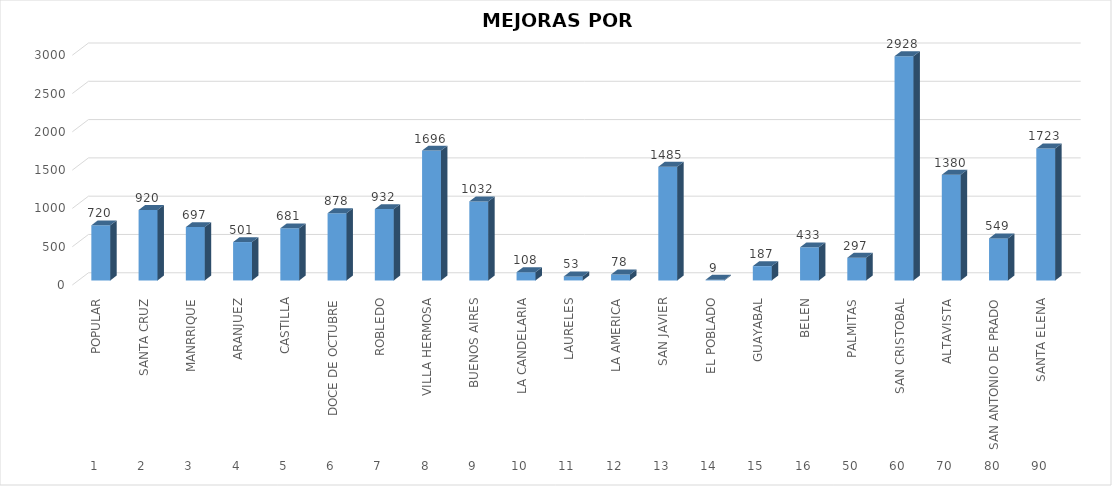
| Category | Mejoras |
|---|---|
| 0 | 720 |
| 1 | 920 |
| 2 | 697 |
| 3 | 501 |
| 4 | 681 |
| 5 | 878 |
| 6 | 932 |
| 7 | 1696 |
| 8 | 1032 |
| 9 | 108 |
| 10 | 53 |
| 11 | 78 |
| 12 | 1485 |
| 13 | 9 |
| 14 | 187 |
| 15 | 433 |
| 16 | 297 |
| 17 | 2928 |
| 18 | 1380 |
| 19 | 549 |
| 20 | 1723 |